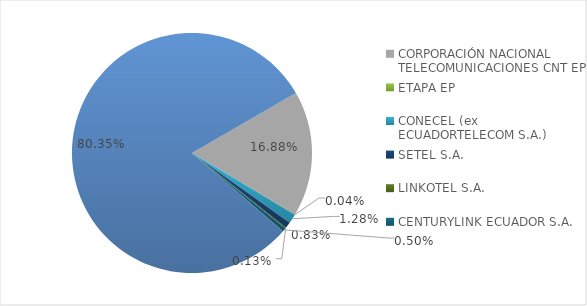
| Category | CODIGO DE AREA 2 |
|---|---|
| CORPORACIÓN NACIONAL TELECOMUNICACIONES CNT EP | 0.169 |
| ETAPA EP | 0 |
| CONECEL (ex ECUADORTELECOM S.A.) | 0.013 |
| SETEL S.A. | 0.008 |
| LINKOTEL S.A. | 0.001 |
| CENTURYLINK ECUADOR S.A. | 0.005 |
| DISPONIBLE | 0.804 |